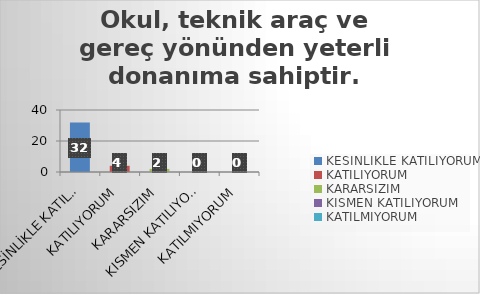
| Category | Okul, teknik araç ve gereç yönünden yeterli donanıma sahiptir. |
|---|---|
| KESİNLİKLE KATILIYORUM | 32 |
| KATILIYORUM | 4 |
| KARARSIZIM | 2 |
| KISMEN KATILIYORUM | 0 |
| KATILMIYORUM | 0 |